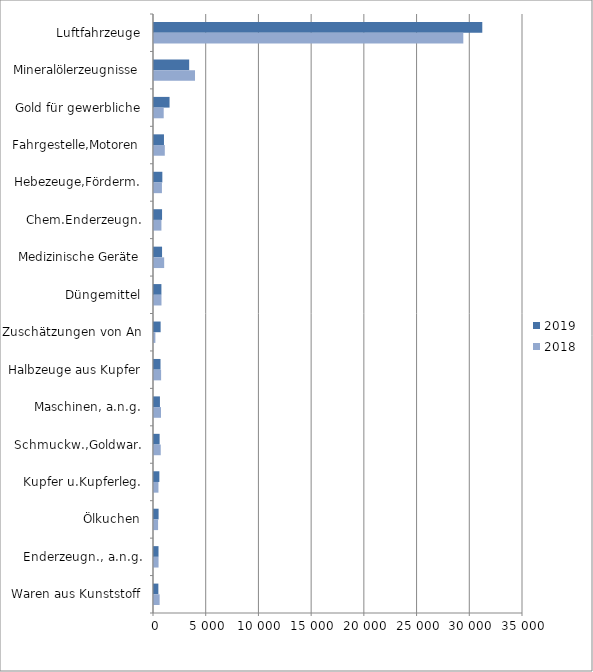
| Category | 2019 | 2018 |
|---|---|---|
| Luftfahrzeuge | 31138.356 | 29338.098 |
| Mineralölerzeugnisse | 3336.346 | 3889.378 |
| Gold für gewerbliche | 1475.916 | 920.571 |
| Fahrgestelle,Motoren | 945.687 | 1024.218 |
| Hebezeuge,Förderm. | 791.038 | 752.736 |
| Chem.Enderzeugn. | 764.478 | 704.127 |
| Medizinische Geräte | 764.436 | 965.188 |
| Düngemittel | 703.136 | 709.954 |
| Zuschätzungen von An | 628.661 | 131.131 |
| Halbzeuge aus Kupfer | 618.072 | 674.711 |
| Maschinen, a.n.g. | 562.969 | 663.976 |
| Schmuckw.,Goldwar. | 533.209 | 639.523 |
| Kupfer u.Kupferleg. | 508.621 | 422.147 |
| Ölkuchen | 435.287 | 388.2 |
| Enderzeugn., a.n.g. | 428.051 | 431.696 |
| Waren aus Kunststoff | 413.762 | 534.304 |